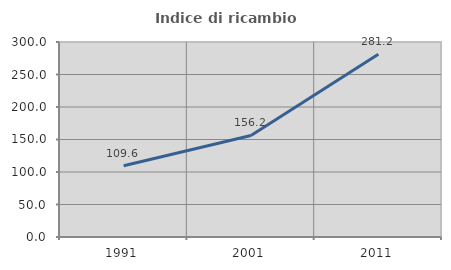
| Category | Indice di ricambio occupazionale  |
|---|---|
| 1991.0 | 109.623 |
| 2001.0 | 156.216 |
| 2011.0 | 281.176 |